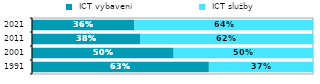
| Category |  ICT vybavení |  ICT služby |
|---|---|---|
| 1991.0 | 0.629 | 0.371 |
| 2001.0 | 0.504 | 0.496 |
| 2011.0 | 0.384 | 0.616 |
| 2021.0 | 0.364 | 0.636 |